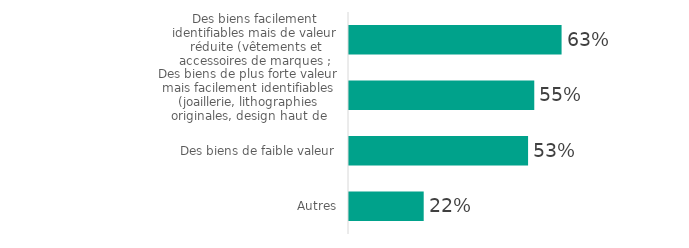
| Category | Series 0 |
|---|---|
| Des biens facilement identifiables mais de valeur réduite (vêtements et accessoires de marques ; jouets ; vins...) | 62.708 |
| Des biens de plus forte valeur mais facilement identifiables (joaillerie, lithographies originales, design haut de gamme.), véhicules d'occasion | 54.654 |
| Des biens de faible valeur | 52.825 |
| Autres | 22.035 |